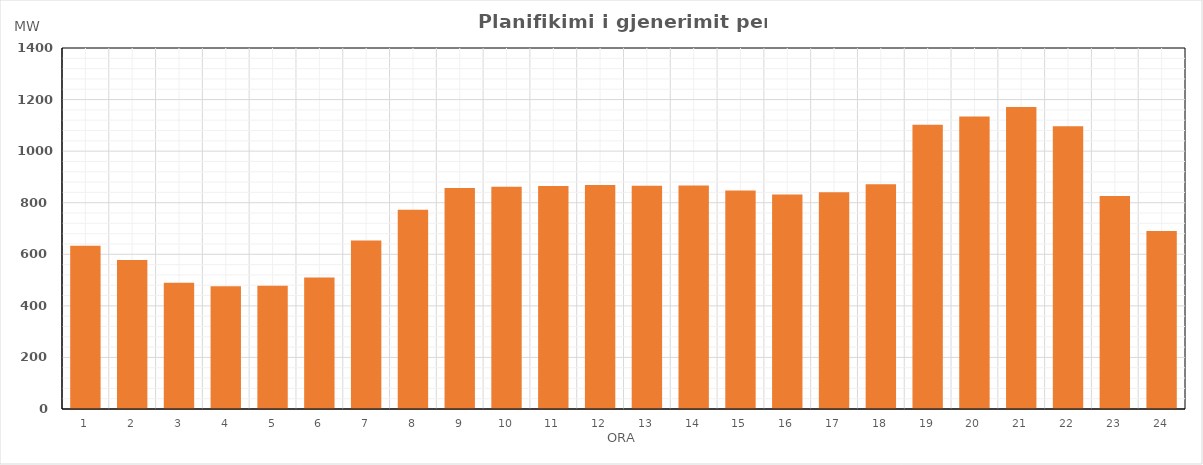
| Category | Max (MW) |
|---|---|
| 0 | 633.57 |
| 1 | 577.55 |
| 2 | 489.13 |
| 3 | 475.64 |
| 4 | 478.41 |
| 5 | 509.6 |
| 6 | 653.57 |
| 7 | 772.65 |
| 8 | 857.04 |
| 9 | 861.67 |
| 10 | 864.55 |
| 11 | 868.6 |
| 12 | 865.88 |
| 13 | 866.32 |
| 14 | 847.41 |
| 15 | 832.24 |
| 16 | 840.33 |
| 17 | 871.2 |
| 18 | 1101.88 |
| 19 | 1134.08 |
| 20 | 1170.9 |
| 21 | 1096.4 |
| 22 | 826.2 |
| 23 | 689.93 |